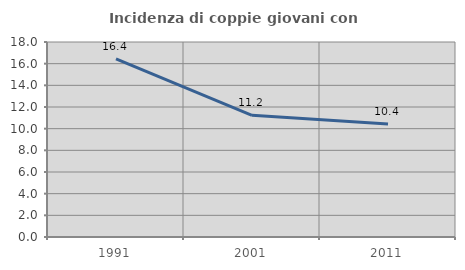
| Category | Incidenza di coppie giovani con figli |
|---|---|
| 1991.0 | 16.444 |
| 2001.0 | 11.236 |
| 2011.0 | 10.442 |